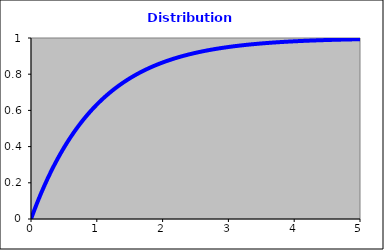
| Category | Series 0 |
|---|---|
| 0.0 | 0 |
| 0.05 | 0.049 |
| 0.1 | 0.095 |
| 0.15 | 0.139 |
| 0.2 | 0.181 |
| 0.25 | 0.221 |
| 0.3 | 0.259 |
| 0.35 | 0.295 |
| 0.4 | 0.33 |
| 0.45 | 0.362 |
| 0.5 | 0.393 |
| 0.55 | 0.423 |
| 0.6 | 0.451 |
| 0.65 | 0.478 |
| 0.7 | 0.503 |
| 0.75 | 0.528 |
| 0.8 | 0.551 |
| 0.85 | 0.573 |
| 0.9 | 0.593 |
| 0.95 | 0.613 |
| 1.0 | 0.632 |
| 1.05 | 0.65 |
| 1.1 | 0.667 |
| 1.15 | 0.683 |
| 1.2 | 0.699 |
| 1.25 | 0.713 |
| 1.3 | 0.727 |
| 1.35 | 0.741 |
| 1.4 | 0.753 |
| 1.45 | 0.765 |
| 1.5 | 0.777 |
| 1.55 | 0.788 |
| 1.6 | 0.798 |
| 1.65 | 0.808 |
| 1.7 | 0.817 |
| 1.75 | 0.826 |
| 1.8 | 0.835 |
| 1.85 | 0.843 |
| 1.9 | 0.85 |
| 1.95 | 0.858 |
| 2.0 | 0.865 |
| 2.05 | 0.871 |
| 2.1 | 0.878 |
| 2.15 | 0.884 |
| 2.2 | 0.889 |
| 2.25 | 0.895 |
| 2.3 | 0.9 |
| 2.35 | 0.905 |
| 2.4 | 0.909 |
| 2.45 | 0.914 |
| 2.5 | 0.918 |
| 2.55 | 0.922 |
| 2.6 | 0.926 |
| 2.65 | 0.929 |
| 2.7 | 0.933 |
| 2.75 | 0.936 |
| 2.8 | 0.939 |
| 2.85 | 0.942 |
| 2.9 | 0.945 |
| 2.95 | 0.948 |
| 3.0 | 0.95 |
| 3.05 | 0.953 |
| 3.1 | 0.955 |
| 3.15 | 0.957 |
| 3.2 | 0.959 |
| 3.25 | 0.961 |
| 3.3 | 0.963 |
| 3.35 | 0.965 |
| 3.4 | 0.967 |
| 3.45 | 0.968 |
| 3.5 | 0.97 |
| 3.55 | 0.971 |
| 3.6 | 0.973 |
| 3.65 | 0.974 |
| 3.7 | 0.975 |
| 3.75 | 0.976 |
| 3.8 | 0.978 |
| 3.85 | 0.979 |
| 3.9 | 0.98 |
| 3.95 | 0.981 |
| 4.0 | 0.982 |
| 4.05 | 0.983 |
| 4.1 | 0.983 |
| 4.15 | 0.984 |
| 4.2 | 0.985 |
| 4.25 | 0.986 |
| 4.3 | 0.986 |
| 4.35 | 0.987 |
| 4.4 | 0.988 |
| 4.45 | 0.988 |
| 4.5 | 0.989 |
| 4.55 | 0.989 |
| 4.6 | 0.99 |
| 4.65 | 0.99 |
| 4.7 | 0.991 |
| 4.75 | 0.991 |
| 4.8 | 0.992 |
| 4.85 | 0.992 |
| 4.9 | 0.993 |
| 4.95 | 0.993 |
| 5.0 | 0.993 |
| 5.05 | 0.994 |
| 5.1 | 0.994 |
| 5.15 | 0.994 |
| 5.2 | 0.994 |
| 5.25 | 0.995 |
| 5.3 | 0.995 |
| 5.35 | 0.995 |
| 5.4 | 0.995 |
| 5.45 | 0.996 |
| 5.5 | 0.996 |
| 5.55 | 0.996 |
| 5.6 | 0.996 |
| 5.65 | 0.996 |
| 5.7 | 0.997 |
| 5.75 | 0.997 |
| 5.8 | 0.997 |
| 5.85 | 0.997 |
| 5.9 | 0.997 |
| 5.95 | 0.997 |
| 6.0 | 0.998 |
| 6.05 | 0.998 |
| 6.1 | 0.998 |
| 6.15 | 0.998 |
| 6.2 | 0.998 |
| 6.25 | 0.998 |
| 6.3 | 0.998 |
| 6.35 | 0.998 |
| 6.4 | 0.998 |
| 6.45 | 0.998 |
| 6.5 | 0.998 |
| 6.55 | 0.999 |
| 6.6 | 0.999 |
| 6.65 | 0.999 |
| 6.7 | 0.999 |
| 6.75 | 0.999 |
| 6.8 | 0.999 |
| 6.85 | 0.999 |
| 6.9 | 0.999 |
| 6.95 | 0.999 |
| 7.0 | 0.999 |
| 7.05 | 0.999 |
| 7.1 | 0.999 |
| 7.15 | 0.999 |
| 7.2 | 0.999 |
| 7.25 | 0.999 |
| 7.3 | 0.999 |
| 7.35 | 0.999 |
| 7.4 | 0.999 |
| 7.45 | 0.999 |
| 7.5 | 0.999 |
| 7.55 | 0.999 |
| 7.6 | 0.999 |
| 7.65 | 1 |
| 7.7 | 1 |
| 7.75 | 1 |
| 7.8 | 1 |
| 7.85 | 1 |
| 7.9 | 1 |
| 7.95 | 1 |
| 8.0 | 1 |
| 8.05 | 1 |
| 8.1 | 1 |
| 8.15 | 1 |
| 8.2 | 1 |
| 8.25 | 1 |
| 8.3 | 1 |
| 8.35 | 1 |
| 8.4 | 1 |
| 8.45 | 1 |
| 8.5 | 1 |
| 8.55 | 1 |
| 8.6 | 1 |
| 8.65 | 1 |
| 8.7 | 1 |
| 8.75 | 1 |
| 8.8 | 1 |
| 8.85 | 1 |
| 8.9 | 1 |
| 8.95 | 1 |
| 9.0 | 1 |
| 9.05 | 1 |
| 9.1 | 1 |
| 9.15 | 1 |
| 9.2 | 1 |
| 9.25 | 1 |
| 9.3 | 1 |
| 9.35 | 1 |
| 9.4 | 1 |
| 9.45 | 1 |
| 9.5 | 1 |
| 9.55 | 1 |
| 9.6 | 1 |
| 9.65 | 1 |
| 9.7 | 1 |
| 9.75 | 1 |
| 9.8 | 1 |
| 9.85 | 1 |
| 9.9 | 1 |
| 9.95 | 1 |
| 10.0 | 1 |